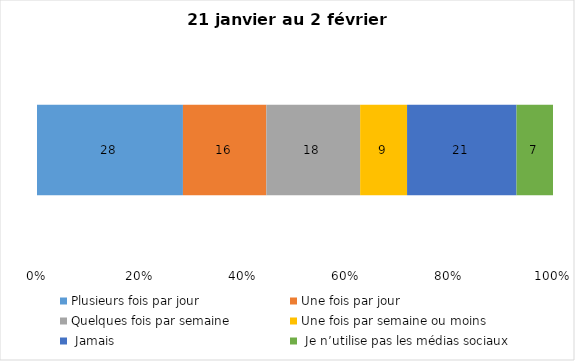
| Category | Plusieurs fois par jour | Une fois par jour | Quelques fois par semaine   | Une fois par semaine ou moins   |  Jamais   |  Je n’utilise pas les médias sociaux |
|---|---|---|---|---|---|---|
| 0 | 28 | 16 | 18 | 9 | 21 | 7 |